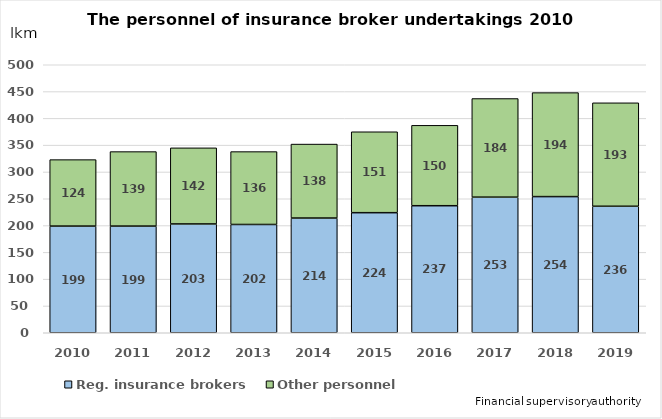
| Category | Reg. insurance brokers | Other personnel |
|---|---|---|
| 2010.0 | 199 | 124 |
| 2011.0 | 199 | 139 |
| 2012.0 | 203 | 142 |
| 2013.0 | 202 | 136 |
| 2014.0 | 214 | 138 |
| 2015.0 | 224 | 151 |
| 2016.0 | 237 | 150 |
| 2017.0 | 253 | 184 |
| 2018.0 | 254 | 194 |
| 2019.0 | 236 | 193 |